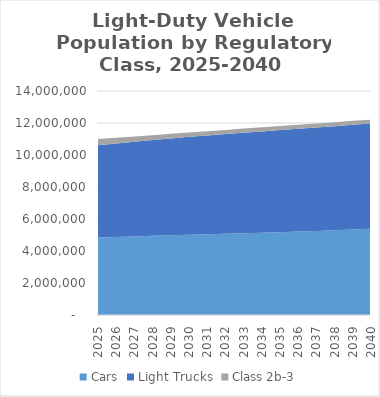
| Category | Cars | Light Trucks | Class 2b-3 |
|---|---|---|---|
| 2025.0 | 4841470.15 | 5775661.364 | 378862.467 |
| 2026.0 | 4877750 | 5844090 | 355650 |
| 2027.0 | 4914030 | 5912520 | 332430 |
| 2028.0 | 4950310 | 5980950 | 309220 |
| 2029.0 | 4986590 | 6049380 | 286000 |
| 2030.0 | 5022869.917 | 6117809.569 | 262784.865 |
| 2031.0 | 5052750 | 6171250 | 261220 |
| 2032.0 | 5082640 | 6224690 | 259660 |
| 2033.0 | 5112520 | 6278130 | 258090 |
| 2034.0 | 5142410 | 6331570 | 256530 |
| 2035.0 | 5172293.209 | 6385004.029 | 254964.014 |
| 2036.0 | 5214970 | 6424510 | 253340 |
| 2037.0 | 5257650 | 6464020 | 251710 |
| 2038.0 | 5300320 | 6503530 | 250080 |
| 2039.0 | 5343000 | 6543030 | 248460 |
| 2040.0 | 5385673.424 | 6582542.125 | 246829.646 |